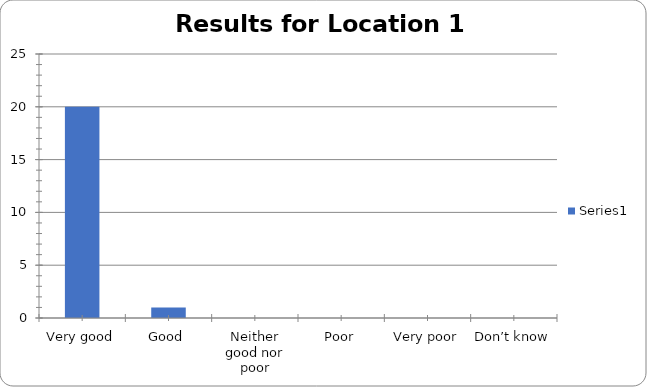
| Category | Series 0 |
|---|---|
| Very good | 20 |
| Good | 1 |
| Neither good nor poor | 0 |
| Poor | 0 |
| Very poor | 0 |
| Don’t know | 0 |